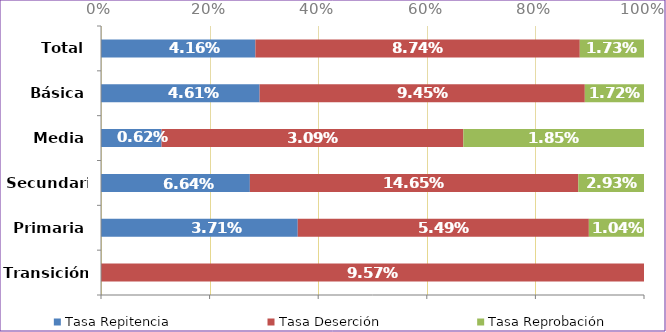
| Category | Tasa Repitencia | Tasa Deserción | Tasa Reprobación |
|---|---|---|---|
| Transición | 0 | 0.096 | 0 |
| Primaria | 0.037 | 0.055 | 0.01 |
| Secundaria | 0.066 | 0.146 | 0.029 |
| Media | 0.006 | 0.031 | 0.018 |
| Básica | 0.046 | 0.094 | 0.017 |
| Total | 0.042 | 0.087 | 0.017 |